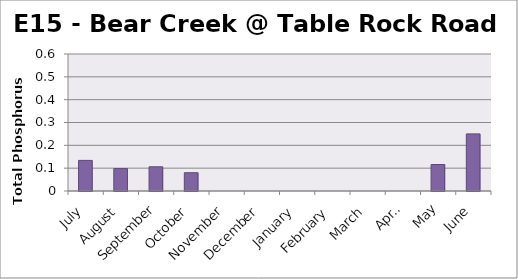
| Category | Phosphorus (mg/L) |
|---|---|
| July | 0.134 |
| August | 0.098 |
| September | 0.106 |
| October | 0.08 |
| November | 0 |
| December | 0 |
| January | 0 |
| February | 0 |
| March | 0 |
| April | 0 |
| May | 0.116 |
| June | 0.25 |